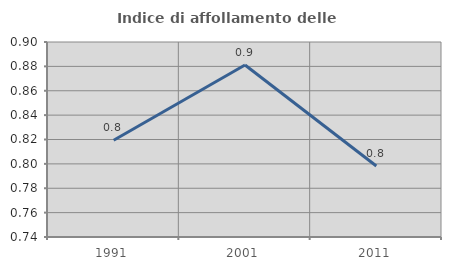
| Category | Indice di affollamento delle abitazioni  |
|---|---|
| 1991.0 | 0.819 |
| 2001.0 | 0.881 |
| 2011.0 | 0.798 |